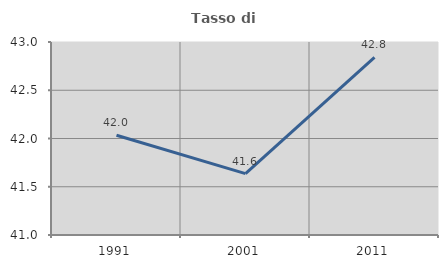
| Category | Tasso di occupazione   |
|---|---|
| 1991.0 | 42.034 |
| 2001.0 | 41.636 |
| 2011.0 | 42.842 |